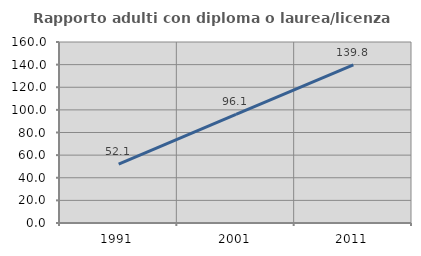
| Category | Rapporto adulti con diploma o laurea/licenza media  |
|---|---|
| 1991.0 | 52.149 |
| 2001.0 | 96.063 |
| 2011.0 | 139.811 |